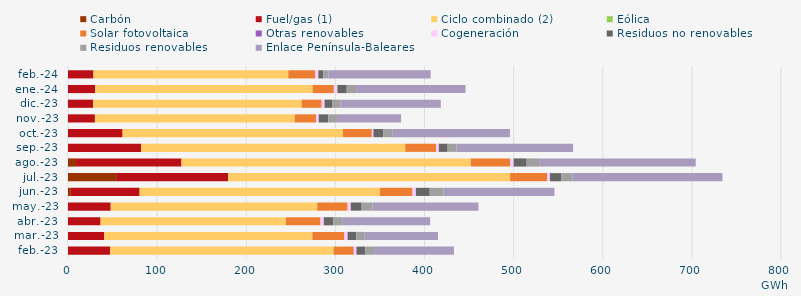
| Category | Carbón | Fuel/gas (1) | Ciclo combinado (2) | Eólica | Solar fotovoltaica | Otras renovables | Cogeneración | Residuos no renovables | Residuos renovables | Enlace Península-Baleares |
|---|---|---|---|---|---|---|---|---|---|---|
| feb.-23 | -0.707 | 47.337 | 250.507 | 0.183 | 22.493 | 0.136 | 3.002 | 9.83 | 9.83 | 89.734 |
| mar.-23 | -0.518 | 40.752 | 233.282 | 0.2 | 35.775 | 0.112 | 3.577 | 9.638 | 9.638 | 82.194 |
| abr.-23 | -0.609 | 36.577 | 207.738 | 0.127 | 38.851 | 0.074 | 3.618 | 10.657 | 10.657 | 98.033 |
| may.-23 | -0.833 | 47.925 | 231.475 | 0.25 | 34.005 | 0.09 | 3.517 | 12.229 | 12.229 | 118.762 |
| jun.-23 | 3.18 | 77.204 | 269.55 | 0.056 | 36.423 | 0.084 | 3.783 | 15.598 | 15.598 | 124.35 |
| jul.-23 | 54.925 | 124.683 | 316.355 | 0.119 | 41.343 | 0.037 | 3.245 | 12.541 | 12.541 | 168.548 |
| ago.-23 | 9.023 | 118.34 | 324.377 | 0.098 | 44.373 | 0.027 | 3.74 | 14.683 | 14.683 | 175.009 |
| sep.-23 | -0.823 | 82.054 | 296.323 | 0 | 34.511 | 0.032 | 3.105 | 9.934 | 9.934 | 130.855 |
| oct.-23 | -0.827 | 61.254 | 247.113 | 0.01 | 32.549 | 0.04 | 1.729 | 10.861 | 10.861 | 131.447 |
| nov.-23 | -0.895 | 30.185 | 224.261 | 0.009 | 23.864 | 0.135 | 2.835 | 10.81 | 10.81 | 70.768 |
| dic.-23 | -0.696 | 28.263 | 233.915 | 0 | 22.335 | 0.126 | 3.21 | 8.992 | 8.992 | 112.44 |
| ene.-24 | -0.706 | 30.444 | 244.02 | 0 | 23.767 | 0.104 | 3.937 | 10.485 | 10.485 | 122.76 |
| feb.-24 | -0.663 | 28.622 | 218.491 | 0 | 30 | 0.031 | 3.74 | 5.609 | 5.609 | 114.744 |